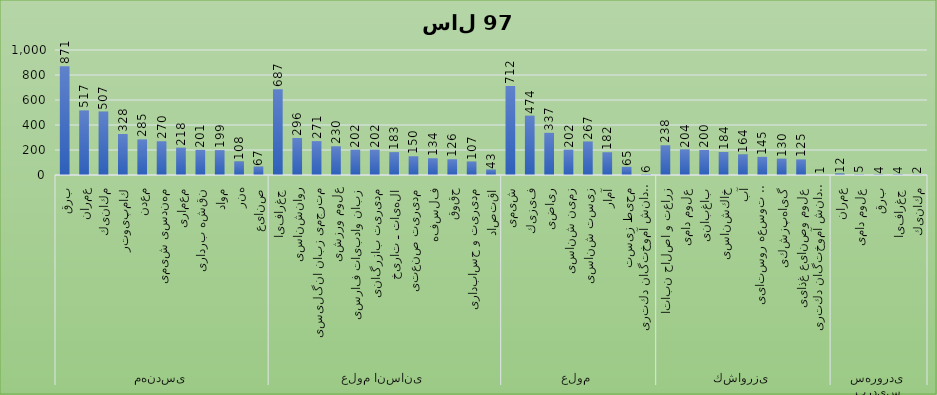
| Category | جمع |
|---|---|
| 0 | 871 |
| 1 | 517 |
| 2 | 507 |
| 3 | 328 |
| 4 | 285 |
| 5 | 270 |
| 6 | 218 |
| 7 | 201 |
| 8 | 199 |
| 9 | 108 |
| 10 | 67 |
| 11 | 687 |
| 12 | 296 |
| 13 | 271 |
| 14 | 230 |
| 15 | 202 |
| 16 | 202 |
| 17 | 183 |
| 18 | 150 |
| 19 | 134 |
| 20 | 126 |
| 21 | 107 |
| 22 | 43 |
| 23 | 712 |
| 24 | 474 |
| 25 | 337 |
| 26 | 202 |
| 27 | 267 |
| 28 | 182 |
| 29 | 65 |
| 30 | 6 |
| 31 | 238 |
| 32 | 204 |
| 33 | 200 |
| 34 | 184 |
| 35 | 164 |
| 36 | 145 |
| 37 | 130 |
| 38 | 125 |
| 39 | 1 |
| 40 | 12 |
| 41 | 5 |
| 42 | 4 |
| 43 | 4 |
| 44 | 2 |